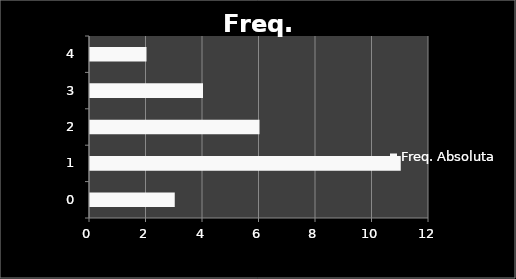
| Category | Freq. Absoluta |
|---|---|
| 0.0 | 3 |
| 1.0 | 11 |
| 2.0 | 6 |
| 3.0 | 4 |
| 4.0 | 2 |